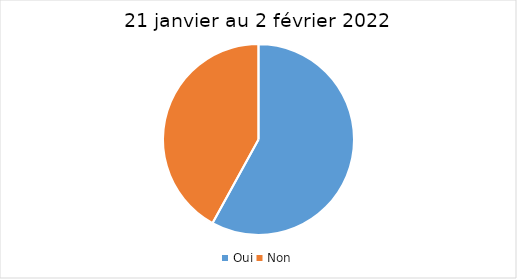
| Category | 21 janvier au 2 février 2022 |
|---|---|
| Oui | 58 |
| Non | 42 |